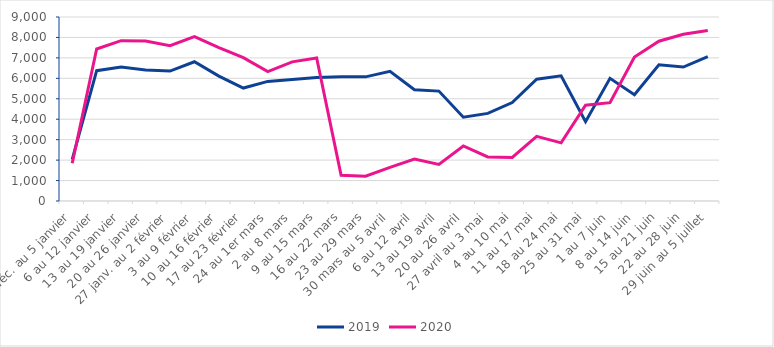
| Category | 2019 | 2020 |
|---|---|---|
| 30 déc. au 5 janvier | 2040 | 1845 |
| 6 au 12 janvier | 6373 | 7436 |
| 13 au 19 janvier | 6555 | 7842 |
| 20 au 26 janvier | 6409 | 7828 |
| 27 janv. au 2 février | 6354 | 7600 |
| 3 au 9 février | 6810 | 8041 |
| 10 au 16 février | 6110 | 7504 |
| 17 au 23 février | 5524 | 7011 |
| 24 au 1er mars | 5849 | 6327 |
| 2 au 8 mars | 5946 | 6805 |
| 9 au 15 mars | 6046 | 6996 |
| 16 au 22 mars | 6072 | 1260 |
| 23 au 29 mars | 6072 | 1210 |
| 30 mars au 5 avril | 6344 | 1648 |
| 6 au 12 avril | 5441 | 2047 |
| 13 au 19 avril | 5376 | 1789 |
| 20 au 26 avril | 4101 | 2690 |
| 27 avril au 3 mai | 4285 | 2153 |
| 4 au 10 mai | 4818 | 2132 |
| 11 au 17 mai | 5955 | 3164 |
| 18 au 24 mai | 6121 | 2844 |
| 25 au 31 mai | 3878 | 4687 |
| 1 au 7 juin | 6002 | 4808 |
| 8 au 14 juin | 5200 | 7045 |
| 15 au 21 juin | 6666 | 7817 |
| 22 au 28 juin | 6551 | 8158 |
| 29 juin au 5 juillet | 7058 | 8335 |